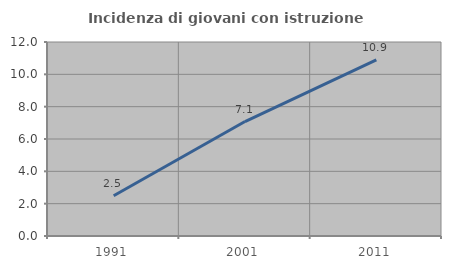
| Category | Incidenza di giovani con istruzione universitaria |
|---|---|
| 1991.0 | 2.489 |
| 2001.0 | 7.081 |
| 2011.0 | 10.889 |